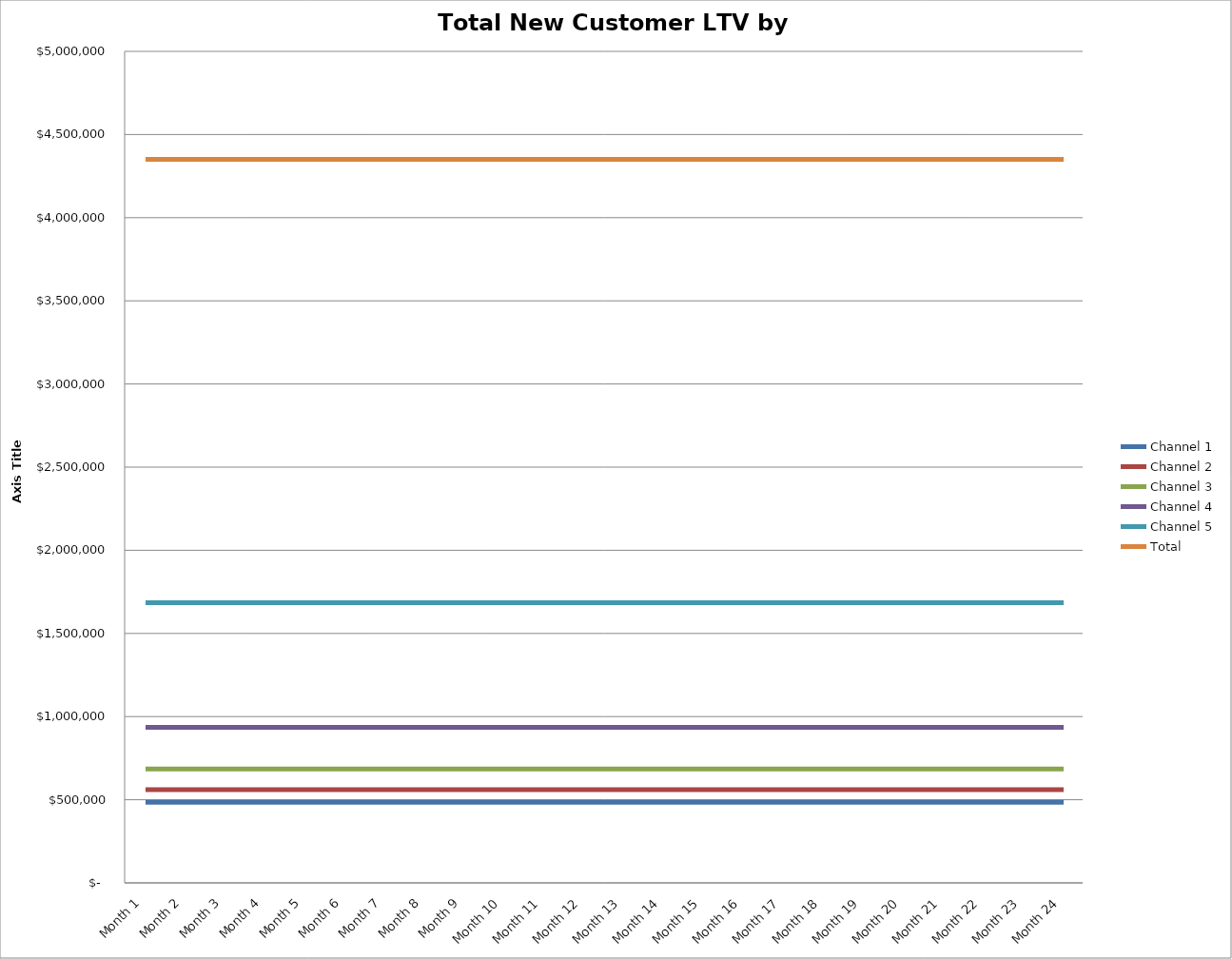
| Category | Channel 1 | Channel 2 | Channel 3 | Channel 4 | Channel 5 | Total |
|---|---|---|---|---|---|---|
| Month 1 | 485000 | 560000 | 685000 | 935000 | 1685000 | 4350000 |
| Month 2 | 485000 | 560000 | 685000 | 935000 | 1685000 | 4350000 |
| Month 3 | 485000 | 560000 | 685000 | 935000 | 1685000 | 4350000 |
| Month 4 | 485000 | 560000 | 685000 | 935000 | 1685000 | 4350000 |
| Month 5 | 485000 | 560000 | 685000 | 935000 | 1685000 | 4350000 |
| Month 6 | 485000 | 560000 | 685000 | 935000 | 1685000 | 4350000 |
| Month 7 | 485000 | 560000 | 685000 | 935000 | 1685000 | 4350000 |
| Month 8 | 485000 | 560000 | 685000 | 935000 | 1685000 | 4350000 |
| Month 9 | 485000 | 560000 | 685000 | 935000 | 1685000 | 4350000 |
| Month 10 | 485000 | 560000 | 685000 | 935000 | 1685000 | 4350000 |
| Month 11 | 485000 | 560000 | 685000 | 935000 | 1685000 | 4350000 |
| Month 12 | 485000 | 560000 | 685000 | 935000 | 1685000 | 4350000 |
| Month 13 | 485000 | 560000 | 685000 | 935000 | 1685000 | 4350000 |
| Month 14 | 485000 | 560000 | 685000 | 935000 | 1685000 | 4350000 |
| Month 15 | 485000 | 560000 | 685000 | 935000 | 1685000 | 4350000 |
| Month 16 | 485000 | 560000 | 685000 | 935000 | 1685000 | 4350000 |
| Month 17 | 485000 | 560000 | 685000 | 935000 | 1685000 | 4350000 |
| Month 18 | 485000 | 560000 | 685000 | 935000 | 1685000 | 4350000 |
| Month 19 | 485000 | 560000 | 685000 | 935000 | 1685000 | 4350000 |
| Month 20 | 485000 | 560000 | 685000 | 935000 | 1685000 | 4350000 |
| Month 21 | 485000 | 560000 | 685000 | 935000 | 1685000 | 4350000 |
| Month 22 | 485000 | 560000 | 685000 | 935000 | 1685000 | 4350000 |
| Month 23 | 485000 | 560000 | 685000 | 935000 | 1685000 | 4350000 |
| Month 24 | 485000 | 560000 | 685000 | 935000 | 1685000 | 4350000 |